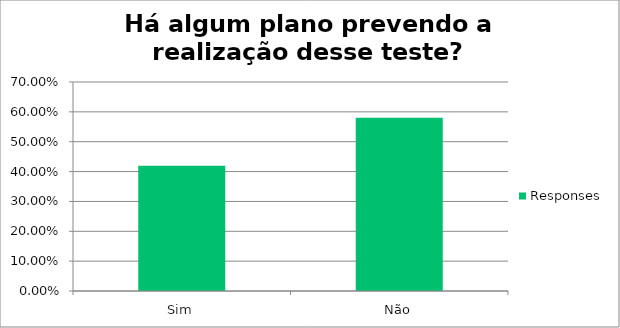
| Category | Responses |
|---|---|
| Sim | 0.419 |
| Não | 0.581 |